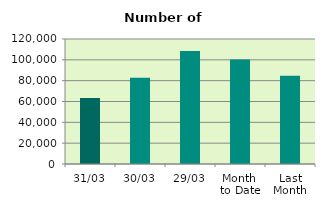
| Category | Series 0 |
|---|---|
| 31/03 | 63340 |
| 30/03 | 82878 |
| 29/03 | 108538 |
| Month 
to Date | 100276.783 |
| Last
Month | 84726.4 |